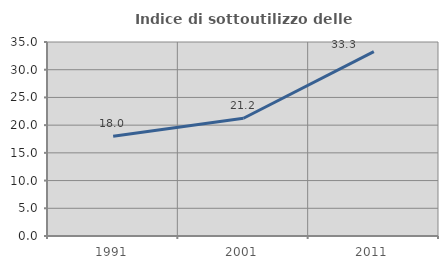
| Category | Indice di sottoutilizzo delle abitazioni  |
|---|---|
| 1991.0 | 18 |
| 2001.0 | 21.241 |
| 2011.0 | 33.271 |